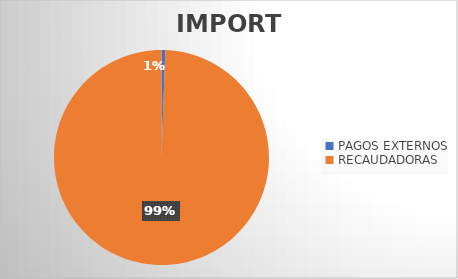
| Category | IMPORTE |
|---|---|
| PAGOS EXTERNOS | 1031211.26 |
| RECAUDADORAS | 181947987.22 |